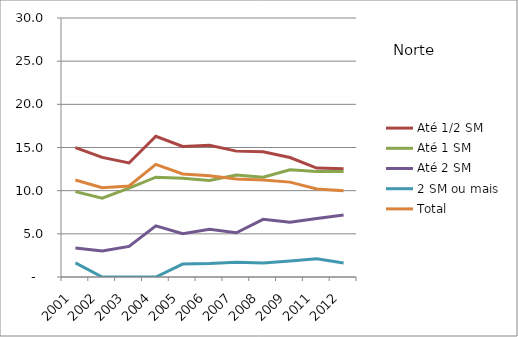
| Category | Até 1/2 SM | Até 1 SM | Até 2 SM | 2 SM ou mais | Total |
|---|---|---|---|---|---|
| 2001.0 | 14.99 | 9.89 | 3.35 | 1.63 | 11.23 |
| 2002.0 | 13.85 | 9.12 | 3.01 | 0 | 10.34 |
| 2003.0 | 13.21 | 10.3 | 3.54 | 0 | 10.54 |
| 2004.0 | 16.3 | 11.56 | 5.93 | 0 | 13.05 |
| 2005.0 | 15.12 | 11.44 | 5.01 | 1.5 | 11.93 |
| 2006.0 | 15.26 | 11.18 | 5.52 | 1.56 | 11.73 |
| 2007.0 | 14.58 | 11.81 | 5.12 | 1.71 | 11.35 |
| 2008.0 | 14.51 | 11.56 | 6.68 | 1.61 | 11.24 |
| 2009.0 | 13.84 | 12.41 | 6.35 | 1.84 | 10.99 |
| 2011.0 | 12.62 | 12.23 | 6.77 | 2.1 | 10.2 |
| 2012.0 | 12.55 | 12.22 | 7.17 | 1.63 | 9.98 |